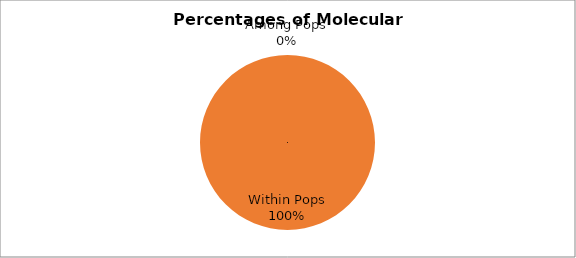
| Category | Est. Var. |
|---|---|
| Among Pops | 0 |
| Within Pops | 21.617 |